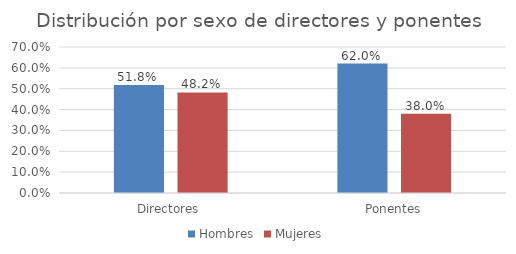
| Category | Hombres | Mujeres |
|---|---|---|
| Directores | 0.518 | 0.482 |
| Ponentes | 0.62 | 0.38 |